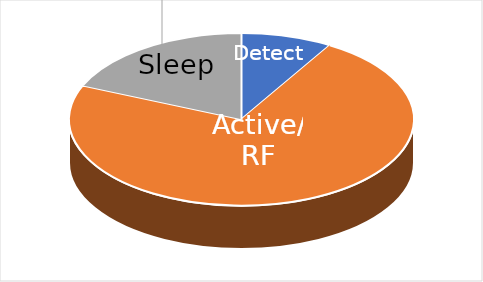
| Category | Series 0 |
|---|---|
| Detect | 19.739 |
| Active/RF | 168.11 |
| Sleep | 42.857 |